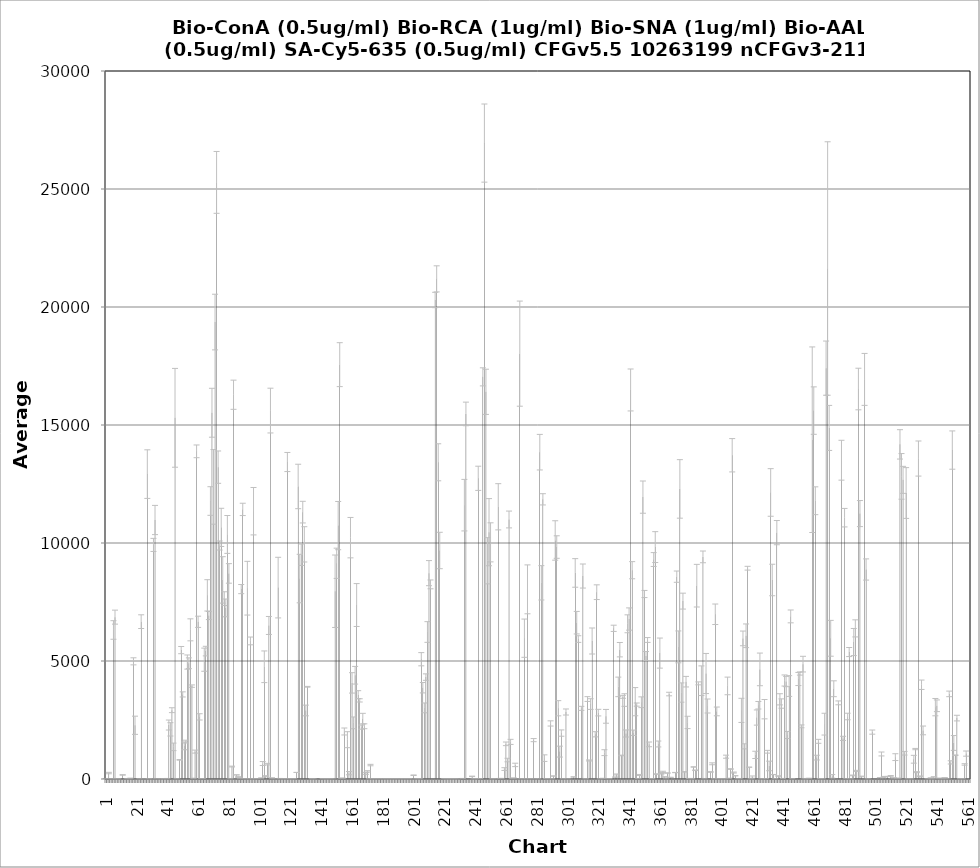
| Category | Average RFU |
|---|---|
| 1.0 | 21.5 |
| 2.0 | -2.75 |
| 3.0 | 252.5 |
| 4.0 | -1 |
| 5.0 | 6 |
| 6.0 | 6314.75 |
| 7.0 | 6858.75 |
| 8.0 | 8.5 |
| 9.0 | -0.5 |
| 10.0 | -3 |
| 11.0 | -1 |
| 12.0 | 172.75 |
| 13.0 | -1.5 |
| 14.0 | -2.5 |
| 15.0 | 9 |
| 16.0 | 8 |
| 17.0 | 30 |
| 18.0 | -0.75 |
| 19.0 | 4985.75 |
| 20.0 | 2276.75 |
| 21.0 | -1.25 |
| 22.0 | -2 |
| 23.0 | 1.5 |
| 24.0 | 6667 |
| 25.0 | -1 |
| 26.0 | -6.75 |
| 27.0 | 1.25 |
| 28.0 | 12918.75 |
| 29.0 | 3.5 |
| 30.0 | -1.25 |
| 31.0 | 0.5 |
| 32.0 | 9918.75 |
| 33.0 | 10974.25 |
| 34.0 | 3.25 |
| 35.0 | -1.75 |
| 36.0 | -1 |
| 37.0 | -0.5 |
| 38.0 | -2.5 |
| 39.0 | 2 |
| 40.0 | 8.75 |
| 41.0 | 21.25 |
| 42.0 | 2286.75 |
| 43.0 | 2103.75 |
| 44.0 | 2915.75 |
| 45.0 | 1362 |
| 46.0 | 15304.25 |
| 47.0 | 6.25 |
| 48.0 | -2.25 |
| 49.0 | 810.75 |
| 50.0 | 5461.75 |
| 51.0 | 3584.25 |
| 52.0 | 1404.75 |
| 53.0 | 1584.5 |
| 54.0 | 4955.5 |
| 55.0 | 4904.75 |
| 56.0 | 6320.5 |
| 57.0 | 3936 |
| 58.0 | 27.5 |
| 59.0 | 1161 |
| 60.0 | 13884 |
| 61.0 | 6661 |
| 62.0 | 2632.75 |
| 63.0 | 19 |
| 64.0 | 17.25 |
| 65.0 | 5055.5 |
| 66.0 | 5419.75 |
| 67.0 | 7781.5 |
| 68.0 | 6925.5 |
| 69.0 | 11779 |
| 70.0 | 15519 |
| 71.0 | 12378.5 |
| 72.0 | 19362.25 |
| 73.0 | 25280 |
| 74.0 | 13214.25 |
| 75.0 | 9894 |
| 76.0 | 10661.75 |
| 77.0 | 8435.75 |
| 78.0 | 7641.5 |
| 79.0 | 7249.75 |
| 80.0 | 10362.5 |
| 81.0 | 8711.25 |
| 82.0 | 6.25 |
| 83.0 | 527.75 |
| 84.0 | 16282.5 |
| 85.0 | -1.75 |
| 86.0 | 174 |
| 87.0 | 83.5 |
| 88.0 | 32.75 |
| 89.0 | 8046.75 |
| 90.0 | 11423.75 |
| 91.0 | 13.75 |
| 92.0 | 0.25 |
| 93.0 | 8084.75 |
| 94.0 | 7 |
| 95.0 | 5850.25 |
| 96.0 | 0 |
| 97.0 | 11347.25 |
| 98.0 | 8.75 |
| 99.0 | 14.75 |
| 100.0 | -1.75 |
| 101.0 | -2 |
| 102.0 | 40.5 |
| 103.0 | 655 |
| 104.0 | 4755.25 |
| 105.0 | 119.5 |
| 106.0 | 630 |
| 107.0 | 6505.5 |
| 108.0 | 15611 |
| 109.0 | 42.75 |
| 110.0 | 1 |
| 111.0 | -18 |
| 112.0 | -1.5 |
| 113.0 | 8109.75 |
| 114.0 | 14.75 |
| 115.0 | 9.5 |
| 116.0 | -0.5 |
| 117.0 | 5.5 |
| 118.0 | 12.75 |
| 119.0 | 13431.5 |
| 120.0 | 13.75 |
| 121.0 | 5.5 |
| 122.0 | 18.75 |
| 123.0 | 12.5 |
| 124.0 | -5.75 |
| 125.0 | 278.5 |
| 126.0 | 12395.5 |
| 127.0 | 8493.5 |
| 128.0 | 9503.5 |
| 129.0 | 11308 |
| 130.0 | 9943 |
| 131.0 | 2903.75 |
| 132.0 | 3907 |
| 133.0 | -0.75 |
| 134.0 | -5.5 |
| 135.0 | 8.75 |
| 136.0 | -0.25 |
| 137.0 | -3.5 |
| 138.0 | -1.25 |
| 139.0 | -1.5 |
| 140.0 | -1.75 |
| 141.0 | -6.25 |
| 142.0 | 17.75 |
| 143.0 | 1.75 |
| 144.0 | 2.75 |
| 145.0 | 14.25 |
| 146.0 | -4.75 |
| 147.0 | 8 |
| 148.0 | -1.25 |
| 149.0 | 2.25 |
| 150.0 | 7956 |
| 151.0 | 9140.25 |
| 152.0 | 10737 |
| 153.0 | 17557.25 |
| 154.0 | 30 |
| 155.0 | 30.25 |
| 156.0 | 2013 |
| 157.0 | -1.5 |
| 158.0 | 1665.75 |
| 159.0 | 247.25 |
| 160.0 | 10226.25 |
| 161.0 | 4072.75 |
| 162.0 | 2379.25 |
| 163.0 | 4396 |
| 164.0 | 7371.75 |
| 165.0 | 3574.25 |
| 166.0 | 3331.25 |
| 167.0 | 2197.75 |
| 168.0 | 2558.25 |
| 169.0 | 2234.5 |
| 170.0 | 239 |
| 171.0 | 322 |
| 172.0 | -0.5 |
| 173.0 | 590.75 |
| 174.0 | 0 |
| 175.0 | 0.5 |
| 176.0 | -0.5 |
| 177.0 | -0.5 |
| 178.0 | -1 |
| 179.0 | 2.75 |
| 180.0 | -1.5 |
| 181.0 | 0 |
| 182.0 | -1.25 |
| 183.0 | 11.25 |
| 184.0 | 0.75 |
| 185.0 | -0.5 |
| 186.0 | -0.5 |
| 187.0 | -13.75 |
| 188.0 | 1.75 |
| 189.0 | -0.75 |
| 190.0 | 7 |
| 191.0 | -2 |
| 192.0 | -0.5 |
| 193.0 | -3 |
| 194.0 | 5.75 |
| 195.0 | 4.25 |
| 196.0 | -3.5 |
| 197.0 | 9 |
| 198.0 | 10.5 |
| 199.0 | -0.75 |
| 200.0 | -21.75 |
| 201.0 | 159.75 |
| 202.0 | 0.25 |
| 203.0 | 0.25 |
| 204.0 | 3 |
| 205.0 | 7.5 |
| 206.0 | 5075.25 |
| 207.0 | 3868.5 |
| 208.0 | 3014 |
| 209.0 | 4317.75 |
| 210.0 | 6229 |
| 211.0 | 8723 |
| 212.0 | 8246.75 |
| 213.0 | -5.5 |
| 214.0 | -2.5 |
| 215.0 | 20297.25 |
| 216.0 | 21192 |
| 217.0 | 13420 |
| 218.0 | 9682.5 |
| 219.0 | -1.75 |
| 220.0 | -33.25 |
| 221.0 | 13 |
| 222.0 | 15.75 |
| 223.0 | -0.5 |
| 224.0 | 0.25 |
| 225.0 | 11 |
| 226.0 | 0.25 |
| 227.0 | 3.5 |
| 228.0 | 1.5 |
| 229.0 | 0 |
| 230.0 | -2.5 |
| 231.0 | -2 |
| 232.0 | -2 |
| 233.0 | 21.75 |
| 234.0 | 11603.25 |
| 235.0 | 15469.5 |
| 236.0 | -1 |
| 237.0 | -3.75 |
| 238.0 | -7.75 |
| 239.0 | 112.25 |
| 240.0 | 0 |
| 241.0 | 15.25 |
| 242.0 | -0.75 |
| 243.0 | 12741 |
| 244.0 | 19.75 |
| 245.0 | -2 |
| 246.0 | 17039.75 |
| 247.0 | 26946 |
| 248.0 | 16406.25 |
| 249.0 | 9248 |
| 250.0 | 10458.25 |
| 251.0 | 10027.75 |
| 252.0 | 0.75 |
| 253.0 | 8 |
| 254.0 | -2 |
| 255.0 | -2.25 |
| 256.0 | 11534.75 |
| 257.0 | 21 |
| 258.0 | 23 |
| 259.0 | -4 |
| 260.0 | 421 |
| 261.0 | 1490.25 |
| 262.0 | 803.75 |
| 263.0 | 10996.5 |
| 264.0 | 1572.5 |
| 265.0 | 14.5 |
| 266.0 | 41.25 |
| 267.0 | 597 |
| 268.0 | 0.5 |
| 269.0 | -22 |
| 270.0 | 18023.5 |
| 271.0 | 0.75 |
| 272.0 | 1.5 |
| 273.0 | 5966.75 |
| 274.0 | 0 |
| 275.0 | 8036.25 |
| 276.0 | 1 |
| 277.0 | 1.5 |
| 278.0 | 2 |
| 279.0 | 1647.5 |
| 280.0 | 0.5 |
| 281.0 | -3.25 |
| 282.0 | 1.5 |
| 283.0 | 13848.5 |
| 284.0 | 8312.75 |
| 285.0 | 11851 |
| 286.0 | 884.25 |
| 287.0 | 19.25 |
| 288.0 | 0.25 |
| 289.0 | -1.25 |
| 290.0 | 2354.5 |
| 291.0 | 3 |
| 292.0 | 125.25 |
| 293.0 | 10107.5 |
| 294.0 | 9828.75 |
| 295.0 | 2998 |
| 296.0 | 1160.25 |
| 297.0 | 1945.75 |
| 298.0 | 5.5 |
| 299.0 | -3.25 |
| 300.0 | 2838.75 |
| 301.0 | -0.5 |
| 302.0 | -2 |
| 303.0 | -7.5 |
| 304.0 | -1.25 |
| 305.0 | 87.75 |
| 306.0 | 8731.75 |
| 307.0 | 6623.75 |
| 308.0 | 5929.5 |
| 309.0 | -0.75 |
| 310.0 | 2993.25 |
| 311.0 | 8600.5 |
| 312.0 | 0.25 |
| 313.0 | 2.25 |
| 314.0 | 3388.5 |
| 315.0 | 785 |
| 316.0 | 3175.25 |
| 317.0 | 5847.5 |
| 318.0 | -1.25 |
| 319.0 | 1894.25 |
| 320.0 | 7915.75 |
| 321.0 | 2812.5 |
| 322.0 | -0.25 |
| 323.0 | -2.5 |
| 324.0 | 26.25 |
| 325.0 | 1116.5 |
| 326.0 | 2655.5 |
| 327.0 | -1 |
| 328.0 | 9.75 |
| 329.0 | -0.75 |
| 330.0 | -1 |
| 331.0 | 6385 |
| 332.0 | 80 |
| 333.0 | 191 |
| 334.0 | 3902.75 |
| 335.0 | 5479.5 |
| 336.0 | 997.75 |
| 337.0 | 3481.75 |
| 338.0 | 3346 |
| 339.0 | 1928.25 |
| 340.0 | 6576.5 |
| 341.0 | 6778.75 |
| 342.0 | 16484.25 |
| 343.0 | 8847.25 |
| 344.0 | 1959.25 |
| 345.0 | 3276.25 |
| 346.0 | 3153.75 |
| 347.0 | 17.75 |
| 348.0 | 170.75 |
| 349.0 | 3252.25 |
| 350.0 | 11944 |
| 351.0 | 7838.75 |
| 352.0 | 5208.75 |
| 353.0 | 5890.75 |
| 354.0 | 1467.5 |
| 355.0 | -34.75 |
| 356.0 | 13.25 |
| 357.0 | 9299.75 |
| 358.0 | 9827 |
| 359.0 | 208.25 |
| 360.0 | 1483.25 |
| 361.0 | 5334.75 |
| 362.0 | 221.25 |
| 363.0 | 303.25 |
| 364.0 | 86.75 |
| 365.0 | 1 |
| 366.0 | 252.5 |
| 367.0 | 3599.75 |
| 368.0 | 67 |
| 369.0 | -1.75 |
| 370.0 | -2 |
| 371.0 | 273.25 |
| 372.0 | 8573.5 |
| 373.0 | 5598.75 |
| 374.0 | 12292 |
| 375.0 | 3663.5 |
| 376.0 | 7537.25 |
| 377.0 | 302 |
| 378.0 | 4123.5 |
| 379.0 | 2396.75 |
| 380.0 | 19 |
| 381.0 | 22.5 |
| 382.0 | 3 |
| 383.0 | 510 |
| 384.0 | 369.75 |
| 385.0 | 8191.25 |
| 386.0 | 4052 |
| 387.0 | -6 |
| 388.0 | 4164.25 |
| 389.0 | 9411.75 |
| 390.0 | 2 |
| 391.0 | 4469.5 |
| 392.0 | 3093 |
| 393.0 | -1 |
| 394.0 | 297.75 |
| 395.0 | 643.75 |
| 396.0 | -0.25 |
| 397.0 | 6979.75 |
| 398.0 | 2863.5 |
| 399.0 | 1 |
| 400.0 | 10.5 |
| 401.0 | -0.25 |
| 402.0 | -0.25 |
| 403.0 | 0.75 |
| 404.0 | 945.75 |
| 405.0 | 3943.75 |
| 406.0 | 28.25 |
| 407.0 | 423 |
| 408.0 | 13717.75 |
| 409.0 | 273.75 |
| 410.0 | 138.25 |
| 411.0 | -3 |
| 412.0 | 7 |
| 413.0 | 4 |
| 414.0 | 2908 |
| 415.0 | 5957.5 |
| 416.0 | 1384.5 |
| 417.0 | 6068.75 |
| 418.0 | 8931.5 |
| 419.0 | 500 |
| 420.0 | -1.25 |
| 421.0 | 80.5 |
| 422.0 | -3.75 |
| 423.0 | 1021.75 |
| 424.0 | 2604.25 |
| 425.0 | 3125.25 |
| 426.0 | 4644.5 |
| 427.0 | -0.25 |
| 428.0 | 0.5 |
| 429.0 | 2958.25 |
| 430.0 | 17.5 |
| 431.0 | 1154.75 |
| 432.0 | 552.75 |
| 433.0 | 12141.75 |
| 434.0 | 8432.5 |
| 435.0 | 187.75 |
| 436.0 | 9 |
| 437.0 | 10439.5 |
| 438.0 | 125.5 |
| 439.0 | 3376.25 |
| 440.0 | 3197 |
| 441.0 | 23 |
| 442.0 | 4173.5 |
| 443.0 | 4130.75 |
| 444.0 | 1864.25 |
| 445.0 | 3939.5 |
| 446.0 | 6889.25 |
| 447.0 | 8.5 |
| 448.0 | -1.75 |
| 449.0 | -1.25 |
| 450.0 | -0.75 |
| 451.0 | 4237.25 |
| 452.0 | 4470 |
| 453.0 | 2231.75 |
| 454.0 | 4867.5 |
| 455.0 | 0 |
| 456.0 | 1 |
| 457.0 | 20.5 |
| 458.0 | 27 |
| 459.0 | -3.5 |
| 460.0 | 14376.5 |
| 461.0 | 15610.25 |
| 462.0 | 11790.5 |
| 463.0 | 906.25 |
| 464.0 | 1596.25 |
| 465.0 | 20 |
| 466.0 | 0.75 |
| 467.0 | 3.5 |
| 468.0 | 2324.25 |
| 469.0 | 17409.25 |
| 470.0 | 21631 |
| 471.0 | 14876.75 |
| 472.0 | 5962.25 |
| 473.0 | 112.75 |
| 474.0 | 3824 |
| 475.0 | -2.75 |
| 476.0 | -1.5 |
| 477.0 | 3226.25 |
| 478.0 | -2 |
| 479.0 | 13507.5 |
| 480.0 | 1720.5 |
| 481.0 | 11072.75 |
| 482.0 | 4.25 |
| 483.0 | 2648.5 |
| 484.0 | 5379.5 |
| 485.0 | 0 |
| 486.0 | 152.5 |
| 487.0 | 5803.75 |
| 488.0 | 6382 |
| 489.0 | 344 |
| 490.0 | 16524.25 |
| 491.0 | 11247 |
| 492.0 | 108 |
| 493.0 | -8.25 |
| 494.0 | 16932.25 |
| 495.0 | 8877.5 |
| 496.0 | -0.5 |
| 497.0 | -3 |
| 498.0 | -4.25 |
| 499.0 | 1987 |
| 500.0 | -1.75 |
| 501.0 | -5 |
| 502.0 | -1.75 |
| 503.0 | -2 |
| 504.0 | 58.5 |
| 505.0 | 1060.5 |
| 506.0 | 57.75 |
| 507.0 | 100 |
| 508.0 | -4.5 |
| 509.0 | 103.75 |
| 510.0 | -1.75 |
| 511.0 | 132 |
| 512.0 | 0 |
| 513.0 | 50.75 |
| 514.0 | 926.5 |
| 515.0 | 11 |
| 516.0 | 33.75 |
| 517.0 | 14179.25 |
| 518.0 | 12822.75 |
| 519.0 | 12675.25 |
| 520.0 | 1091 |
| 521.0 | 12118.25 |
| 522.0 | -0.75 |
| 523.0 | -2.25 |
| 524.0 | -0.5 |
| 525.0 | -1.75 |
| 526.0 | 836.75 |
| 527.0 | 1268.25 |
| 528.0 | 289.75 |
| 529.0 | 13579 |
| 530.0 | 119.5 |
| 531.0 | 3993.75 |
| 532.0 | 2058.75 |
| 533.0 | -2.25 |
| 534.0 | -1.75 |
| 535.0 | -0.75 |
| 536.0 | -1 |
| 537.0 | 42.75 |
| 538.0 | -0.25 |
| 539.0 | 87.75 |
| 540.0 | 3044.75 |
| 541.0 | 3102.5 |
| 542.0 | 32.75 |
| 543.0 | -2 |
| 544.0 | -0.25 |
| 545.0 | 14.5 |
| 546.0 | 61.25 |
| 547.0 | 3 |
| 548.0 | 0 |
| 549.0 | 3606.25 |
| 550.0 | 704 |
| 551.0 | 13937.75 |
| 552.0 | 1527.25 |
| 553.0 | 1007.75 |
| 554.0 | 2580.75 |
| 555.0 | -2.25 |
| 556.0 | 4.75 |
| 557.0 | 15.25 |
| 558.0 | 0.5 |
| 559.0 | 617.25 |
| 560.0 | 1076.75 |
| 561.0 | -2 |
| 562.0 | -1.75 |